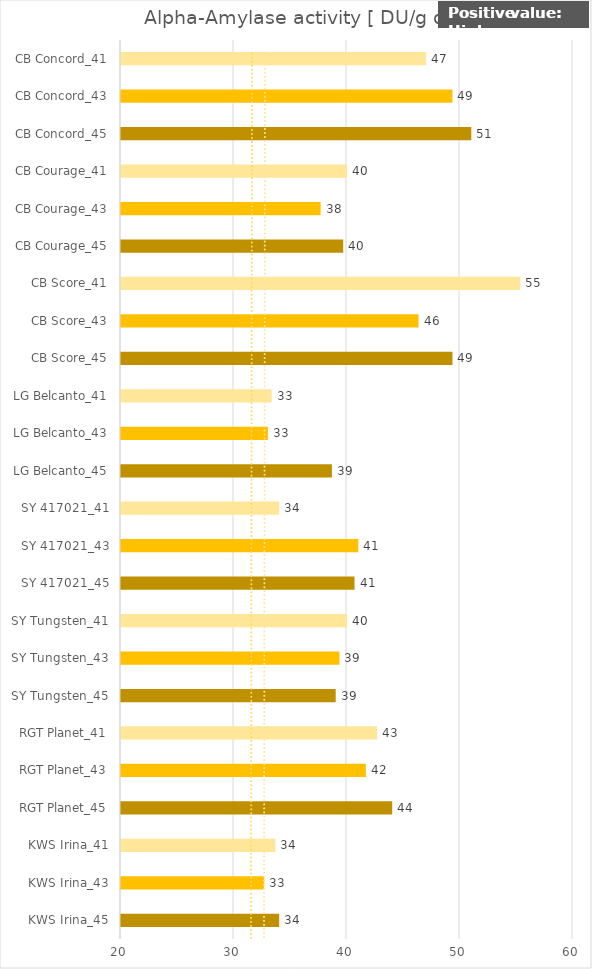
| Category |    Alpha-Amylase activity [ DU/g dm] |
|---|---|
| KWS Irina_45 | 34 |
| KWS Irina_43 | 32.667 |
| KWS Irina_41 | 33.667 |
| RGT Planet_45 | 44 |
| RGT Planet_43 | 41.667 |
| RGT Planet_41 | 42.667 |
| SY Tungsten_45 | 39 |
| SY Tungsten_43 | 39.333 |
| SY Tungsten_41 | 40 |
| SY 417021_45 | 40.667 |
| SY 417021_43 | 41 |
| SY 417021_41 | 34 |
| LG Belcanto_45 | 38.667 |
| LG Belcanto_43 | 33 |
| LG Belcanto_41 | 33.333 |
| CB Score_45 | 49.333 |
| CB Score_43 | 46.333 |
| CB Score_41 | 55.333 |
| CB Courage_45 | 39.667 |
| CB Courage_43 | 37.667 |
| CB Courage_41 | 40 |
| CB Concord_45 | 51 |
| CB Concord_43 | 49.333 |
| CB Concord_41 | 47 |